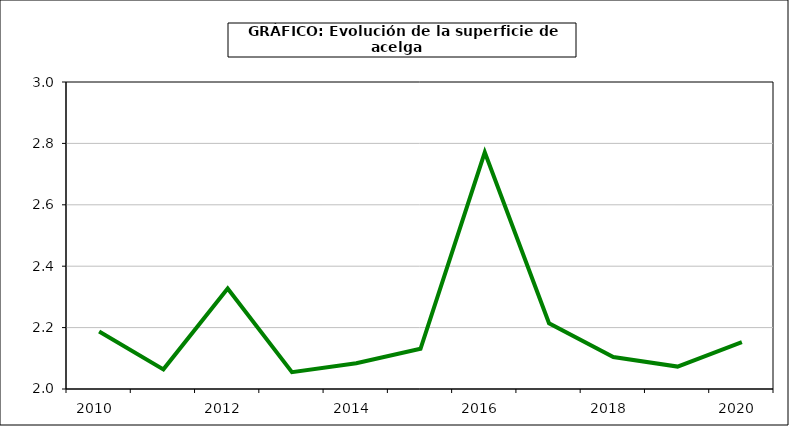
| Category | superficie |
|---|---|
| 2010.0 | 2.187 |
| 2011.0 | 2.064 |
| 2012.0 | 2.327 |
| 2013.0 | 2.055 |
| 2014.0 | 2.084 |
| 2015.0 | 2.131 |
| 2016.0 | 2.771 |
| 2017.0 | 2.214 |
| 2018.0 | 2.104 |
| 2019.0 | 2.073 |
| 2020.0 | 2.153 |